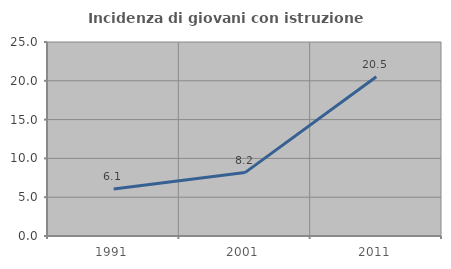
| Category | Incidenza di giovani con istruzione universitaria |
|---|---|
| 1991.0 | 6.061 |
| 2001.0 | 8.171 |
| 2011.0 | 20.532 |